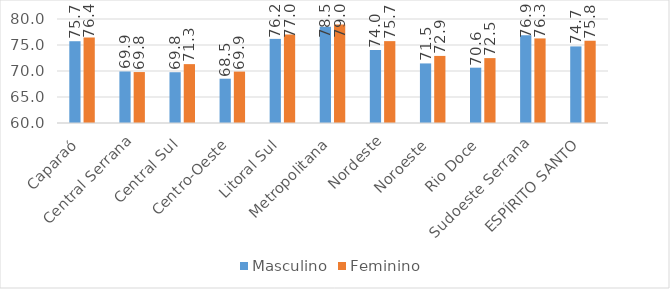
| Category | Masculino | Feminino  |
|---|---|---|
| Caparaó | 75.726 | 76.438 |
| Central Serrana | 69.91 | 69.796 |
| Central Sul | 69.765 | 71.322 |
| Centro-Oeste | 68.519 | 69.885 |
| Litoral Sul | 76.177 | 77.043 |
| Metropolitana | 78.495 | 78.959 |
| Nordeste | 74.022 | 75.745 |
| Noroeste | 71.456 | 72.9 |
| Rio Doce | 70.639 | 72.477 |
| Sudoeste Serrana | 76.885 | 76.265 |
| ESPÍRITO SANTO | 74.727 | 75.818 |